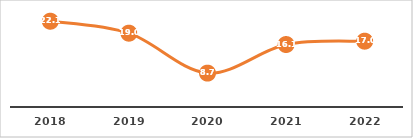
| Category | REPROBACIÓN (%) |
|---|---|
| 2018.0 | 22.105 |
| 2019.0 | 19.023 |
| 2020.0 | 8.732 |
| 2021.0 | 16.101 |
| 2022.0 | 16.965 |